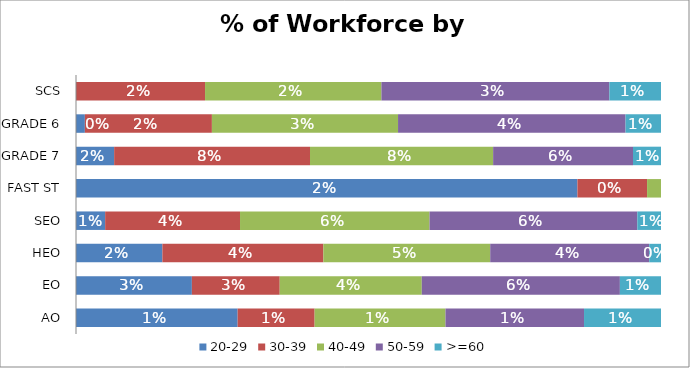
| Category | 20-29 | 30-39 | 40-49 | 50-59 | >=60 |
|---|---|---|---|---|---|
| AO | 0.011 | 0.005 | 0.009 | 0.01 | 0.005 |
| EO | 0.034 | 0.025 | 0.041 | 0.057 | 0.012 |
| HEO | 0.024 | 0.044 | 0.046 | 0.044 | 0.003 |
| SEO | 0.009 | 0.04 | 0.056 | 0.062 | 0.007 |
| FAST ST | 0.02 | 0.003 | 0.001 | 0 | 0 |
| GRADE 7 | 0.016 | 0.084 | 0.078 | 0.06 | 0.012 |
| GRADE 6 | 0.002 | 0.023 | 0.034 | 0.042 | 0.007 |
| SCS | 0 | 0.016 | 0.022 | 0.029 | 0.007 |